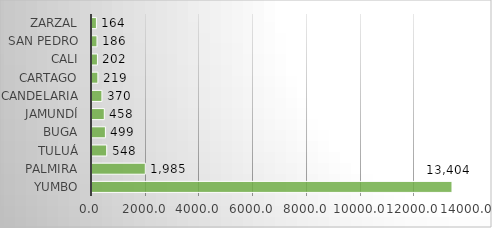
| Category | Series 0 |
|---|---|
| YUMBO | 13403.921 |
| PALMIRA | 1984.518 |
| TULUÁ | 547.891 |
| BUGA | 498.887 |
| JAMUNDÍ | 457.974 |
| CANDELARIA | 369.985 |
| CARTAGO | 219.262 |
| CALI | 202.048 |
| SAN PEDRO | 185.506 |
| ZARZAL | 164.233 |